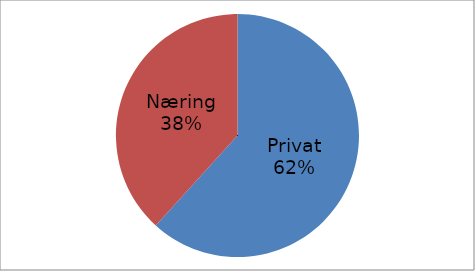
| Category | Series 0 |
|---|---|
| Privat | 47694631 |
| Næring | 29552047 |